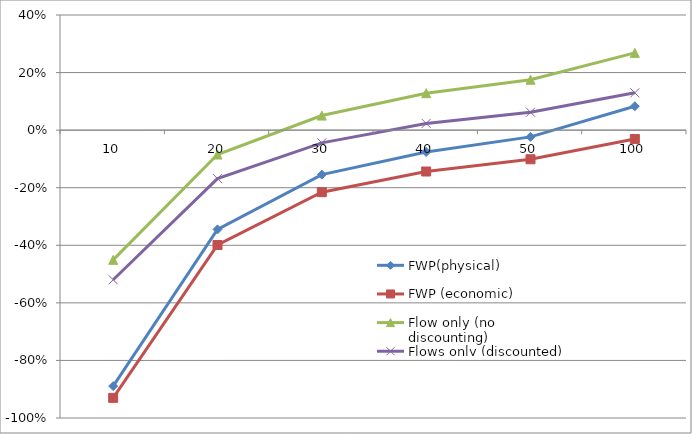
| Category | FWP(physical) | FWP (economic) | Flow only (no discounting) | Flows only (discounted) |
|---|---|---|---|---|
| 10.0 | -0.889 | -0.93 | -0.451 | -0.52 |
| 20.0 | -0.345 | -0.399 | -0.085 | -0.169 |
| 30.0 | -0.154 | -0.216 | 0.051 | -0.044 |
| 40.0 | -0.076 | -0.144 | 0.128 | 0.023 |
| 50.0 | -0.023 | -0.101 | 0.175 | 0.062 |
| 100.0 | 0.083 | -0.031 | 0.268 | 0.13 |